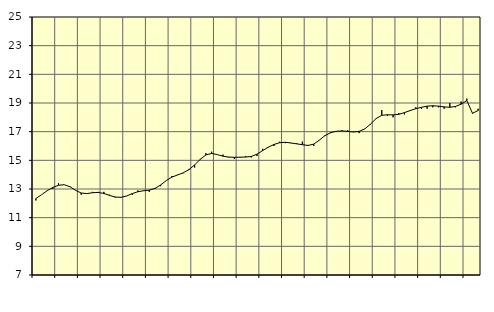
| Category | Piggar | Finansiell verksamhet, företagstjänster, SNI 64-82 |
|---|---|---|
| nan | 12.2 | 12.33 |
| 1.0 | 12.6 | 12.6 |
| 1.0 | 12.9 | 12.88 |
| 1.0 | 13 | 13.11 |
| nan | 13.4 | 13.26 |
| 2.0 | 13.3 | 13.3 |
| 2.0 | 13.2 | 13.16 |
| 2.0 | 12.9 | 12.91 |
| nan | 12.6 | 12.72 |
| 3.0 | 12.7 | 12.68 |
| 3.0 | 12.8 | 12.74 |
| 3.0 | 12.8 | 12.76 |
| nan | 12.8 | 12.69 |
| 4.0 | 12.6 | 12.55 |
| 4.0 | 12.4 | 12.44 |
| 4.0 | 12.4 | 12.42 |
| nan | 12.5 | 12.51 |
| 5.0 | 12.6 | 12.68 |
| 5.0 | 12.9 | 12.81 |
| 5.0 | 12.9 | 12.88 |
| nan | 12.8 | 12.92 |
| 6.0 | 13 | 13.04 |
| 6.0 | 13.2 | 13.28 |
| 6.0 | 13.6 | 13.59 |
| nan | 13.9 | 13.83 |
| 7.0 | 14 | 13.98 |
| 7.0 | 14.1 | 14.13 |
| 7.0 | 14.4 | 14.35 |
| nan | 14.5 | 14.68 |
| 8.0 | 15.1 | 15.07 |
| 8.0 | 15.5 | 15.38 |
| 8.0 | 15.6 | 15.48 |
| nan | 15.4 | 15.4 |
| 9.0 | 15.4 | 15.29 |
| 9.0 | 15.2 | 15.23 |
| 9.0 | 15.1 | 15.21 |
| nan | 15.2 | 15.22 |
| 10.0 | 15.3 | 15.23 |
| 10.0 | 15.2 | 15.27 |
| 10.0 | 15.3 | 15.43 |
| nan | 15.8 | 15.68 |
| 11.0 | 15.9 | 15.92 |
| 11.0 | 16 | 16.11 |
| 11.0 | 16.3 | 16.23 |
| nan | 16.2 | 16.26 |
| 12.0 | 16.2 | 16.21 |
| 12.0 | 16.2 | 16.15 |
| 12.0 | 16.3 | 16.09 |
| nan | 16 | 16.04 |
| 13.0 | 16 | 16.13 |
| 13.0 | 16.4 | 16.41 |
| 13.0 | 16.7 | 16.73 |
| nan | 16.9 | 16.93 |
| 14.0 | 17 | 17.03 |
| 14.0 | 17.1 | 17.05 |
| 14.0 | 17.1 | 17.02 |
| nan | 17 | 16.98 |
| 15.0 | 16.9 | 17.02 |
| 15.0 | 17.2 | 17.19 |
| 15.0 | 17.5 | 17.52 |
| nan | 17.9 | 17.91 |
| 16.0 | 18.5 | 18.14 |
| 16.0 | 18.1 | 18.18 |
| 16.0 | 18 | 18.17 |
| nan | 18.3 | 18.21 |
| 17.0 | 18.2 | 18.33 |
| 17.0 | 18.5 | 18.47 |
| 17.0 | 18.7 | 18.6 |
| nan | 18.6 | 18.7 |
| 18.0 | 18.6 | 18.78 |
| 18.0 | 18.7 | 18.81 |
| 18.0 | 18.7 | 18.78 |
| nan | 18.6 | 18.73 |
| 19.0 | 19 | 18.7 |
| 19.0 | 18.7 | 18.76 |
| 19.0 | 19.1 | 18.92 |
| nan | 19.3 | 19.17 |
| 20.0 | 18.3 | 18.28 |
| 20.0 | 18.6 | 18.48 |